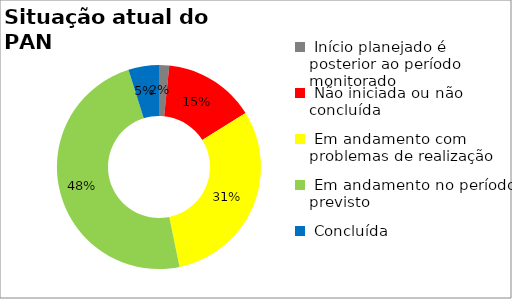
| Category | Series 0 |
|---|---|
|  Início planejado é posterior ao período monitorado | 0.016 |
|  Não iniciada ou não concluída | 0.145 |
|  Em andamento com problemas de realização | 0.306 |
|  Em andamento no período previsto  | 0.484 |
|  Concluída | 0.048 |